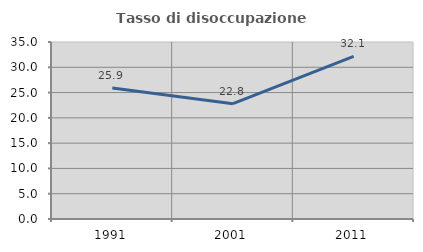
| Category | Tasso di disoccupazione giovanile  |
|---|---|
| 1991.0 | 25.893 |
| 2001.0 | 22.807 |
| 2011.0 | 32.143 |